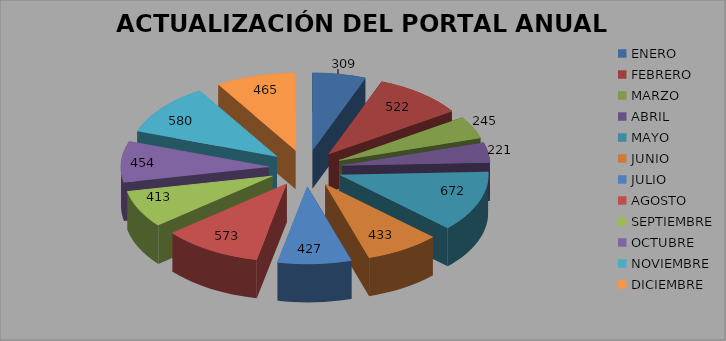
| Category | ACTUALIZACIÓN DEL PORTAL ANUAL 2016 |
|---|---|
| ENERO | 309 |
| FEBRERO | 522 |
| MARZO | 245 |
| ABRIL | 221 |
| MAYO | 672 |
| JUNIO | 433 |
| JULIO | 427 |
| AGOSTO | 573 |
| SEPTIEMBRE | 413 |
| OCTUBRE | 454 |
| NOVIEMBRE | 580 |
| DICIEMBRE | 465 |